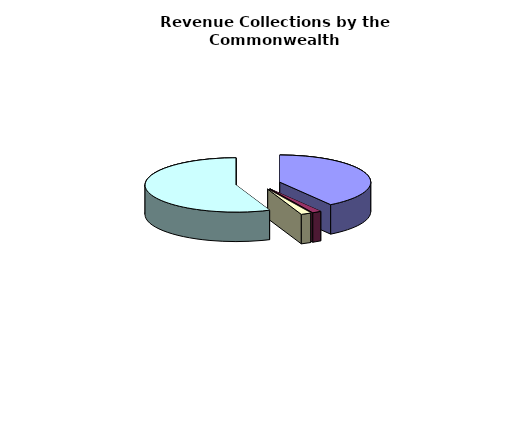
| Category | Series 0 |
|---|---|
| General Fund | 20553037000 |
| Non-General Fund | 822241000 |
| General Fund | 914057000 |
| Non-General Fund | 28403204000 |